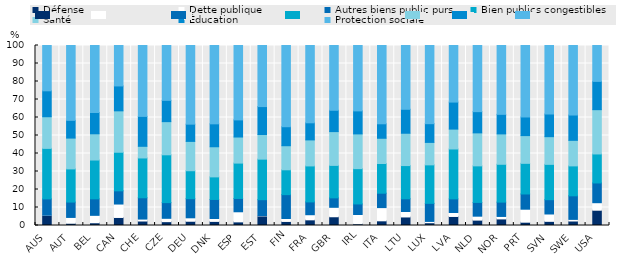
| Category | Défense | Dette publique | Autres biens public purs | Bien publics congestibles | Santé | Éducation | Protection sociale |
|---|---|---|---|---|---|---|---|
| AUS | 5.73 | 0.005 | 9.052 | 28.055 | 17.583 | 14.404 | 25.17 |
| AUT | 1.242 | 3.238 | 8.536 | 18.441 | 17.109 | 9.855 | 41.579 |
| BEL | 1.519 | 4.12 | 9.169 | 21.57 | 14.577 | 11.83 | 37.216 |
| CAN | 4.465 | 7.455 | 7.341 | 21.431 | 23.012 | 13.825 | 22.471 |
| CHE | 2.492 | 1.08 | 11.837 | 22.113 | 6.472 | 16.622 | 39.383 |
| CZE | 2.135 | 1.855 | 8.722 | 26.566 | 18.415 | 11.842 | 30.465 |
| DEU | 2.358 | 1.913 | 10.616 | 15.533 | 16.302 | 9.576 | 43.7 |
| DNK | 2.28 | 1.611 | 10.581 | 12.538 | 16.733 | 12.741 | 43.517 |
| ESP | 2.015 | 5.609 | 7.395 | 19.652 | 14.482 | 9.517 | 41.329 |
| EST | 5.32 | 0.184 | 8.837 | 22.52 | 13.692 | 15.516 | 33.931 |
| FIN | 2.252 | 1.647 | 13.238 | 13.81 | 13.373 | 10.555 | 45.125 |
| FRA | 3.147 | 2.842 | 7.109 | 19.996 | 14.458 | 9.503 | 42.946 |
| GBR | 4.856 | 5.247 | 5.243 | 18.046 | 18.768 | 11.854 | 35.985 |
| IRL | 0.945 | 5.161 | 5.866 | 19.629 | 19.286 | 12.787 | 36.326 |
| ITA | 2.605 | 7.335 | 8.006 | 16.507 | 14.013 | 8.041 | 43.493 |
| LTU | 4.745 | 3.016 | 7.079 | 18.452 | 17.96 | 13.316 | 35.432 |
| LUX | 1.541 | 0.722 | 10.049 | 21.374 | 12.478 | 10.406 | 43.43 |
| LVA | 5.018 | 2.194 | 7.581 | 27.718 | 11.044 | 15.012 | 31.434 |
| NLD | 2.988 | 2.19 | 7.643 | 20.312 | 18.323 | 11.795 | 36.749 |
| NOR | 3.654 | 1.375 | 7.957 | 21.026 | 16.881 | 10.867 | 38.24 |
| PRT | 1.832 | 7.224 | 8.453 | 17.027 | 15.405 | 10.342 | 39.716 |
| SVN | 2.308 | 4.084 | 7.95 | 19.632 | 15.373 | 12.597 | 38.056 |
| SWE | 2.495 | 0.899 | 13.098 | 16.621 | 14.193 | 14.067 | 38.627 |
| USA | 8.49 | 4.174 | 10.97 | 16.115 | 24.6 | 15.717 | 19.934 |